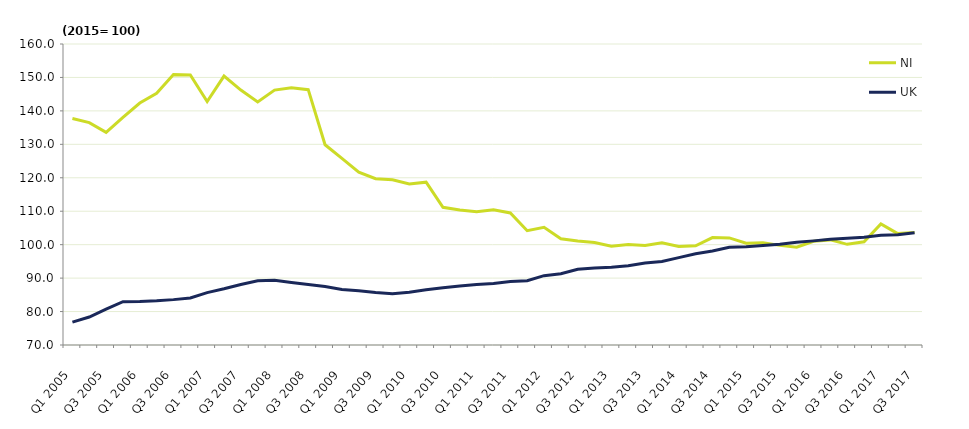
| Category | NI | UK |
|---|---|---|
| Q1 2005 | 137.726 | 76.833 |
| Q2 2005 | 136.504 | 78.367 |
| Q3 2005 | 133.583 | 80.7 |
| Q4 2005 | 138.059 | 82.967 |
| Q1 2006 | 142.349 | 83 |
| Q2 2006 | 145.267 | 83.2 |
| Q3 2006 | 150.845 | 83.567 |
| Q4 2006 | 150.72 | 84.067 |
| Q1 2007 | 142.806 | 85.667 |
| Q2 2007 | 150.411 | 86.8 |
| Q3 2007 | 146.22 | 88.067 |
| Q4 2007 | 142.669 | 89.2 |
| Q1 2008 | 146.225 | 89.333 |
| Q2 2008 | 146.882 | 88.667 |
| Q3 2008 | 146.348 | 88.1 |
| Q4 2008 | 129.864 | 87.467 |
| Q1 2009 | 125.799 | 86.6 |
| Q2 2009 | 121.704 | 86.2 |
| Q3 2009 | 119.707 | 85.7 |
| Q4 2009 | 119.392 | 85.333 |
| Q1 2010 | 118.116 | 85.767 |
| Q2 2010 | 118.685 | 86.5 |
| Q3 2010 | 111.171 | 87.133 |
| Q4 2010 | 110.381 | 87.667 |
| Q1 2011 | 109.833 | 88.1 |
| Q2 2011 | 110.418 | 88.4 |
| Q3 2011 | 109.491 | 89 |
| Q4 2011 | 104.171 | 89.2 |
| Q1 2012 | 105.214 | 90.733 |
| Q2 2012 | 101.762 | 91.333 |
| Q3 2012 | 101.116 | 92.667 |
| Q4 2012 | 100.622 | 93 |
| Q1 2013 | 99.543 | 93.267 |
| Q2 2013 | 100.027 | 93.667 |
| Q3 2013 | 99.774 | 94.533 |
| Q4 2013 | 100.569 | 94.967 |
| Q1 2014 | 99.47 | 96.133 |
| Q2 2014 | 99.671 | 97.267 |
| Q3 2014 | 102.124 | 98.1 |
| Q4 2014 | 102.013 | 99.2 |
| Q1 2015 | 100.432 | 99.4 |
| Q2 2015 | 100.556 | 99.733 |
| Q3 2015 | 99.787 | 100.133 |
| Q4 2015 | 99.225 | 100.733 |
| Q1 2016 | 101.016 | 101.133 |
| Q2 2016 | 101.429 | 101.633 |
| Q3 2016 | 100.1 | 101.9 |
| Q4 2016 | 100.877 | 102.2 |
| Q1 2017 | 106.215 | 102.833 |
| Q2 2017 | 103.303 | 102.933 |
| Q3 2017 | 103.676 | 103.567 |